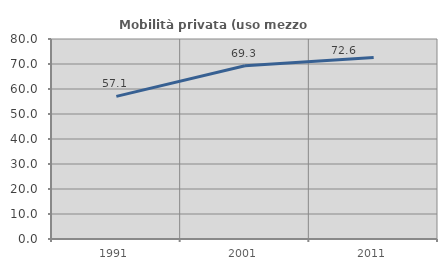
| Category | Mobilità privata (uso mezzo privato) |
|---|---|
| 1991.0 | 57.066 |
| 2001.0 | 69.283 |
| 2011.0 | 72.577 |